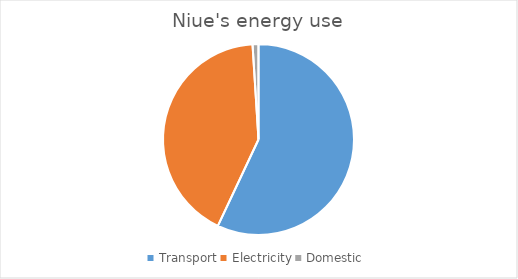
| Category | Series 0 |
|---|---|
| Transport | 57 |
| Electricity | 42 |
| Domestic | 1 |